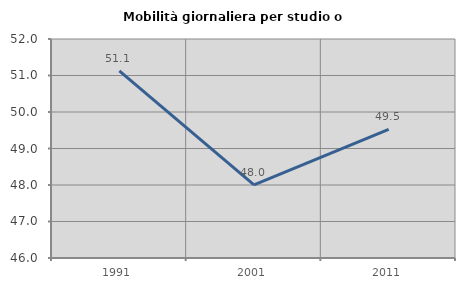
| Category | Mobilità giornaliera per studio o lavoro |
|---|---|
| 1991.0 | 51.126 |
| 2001.0 | 48.001 |
| 2011.0 | 49.527 |